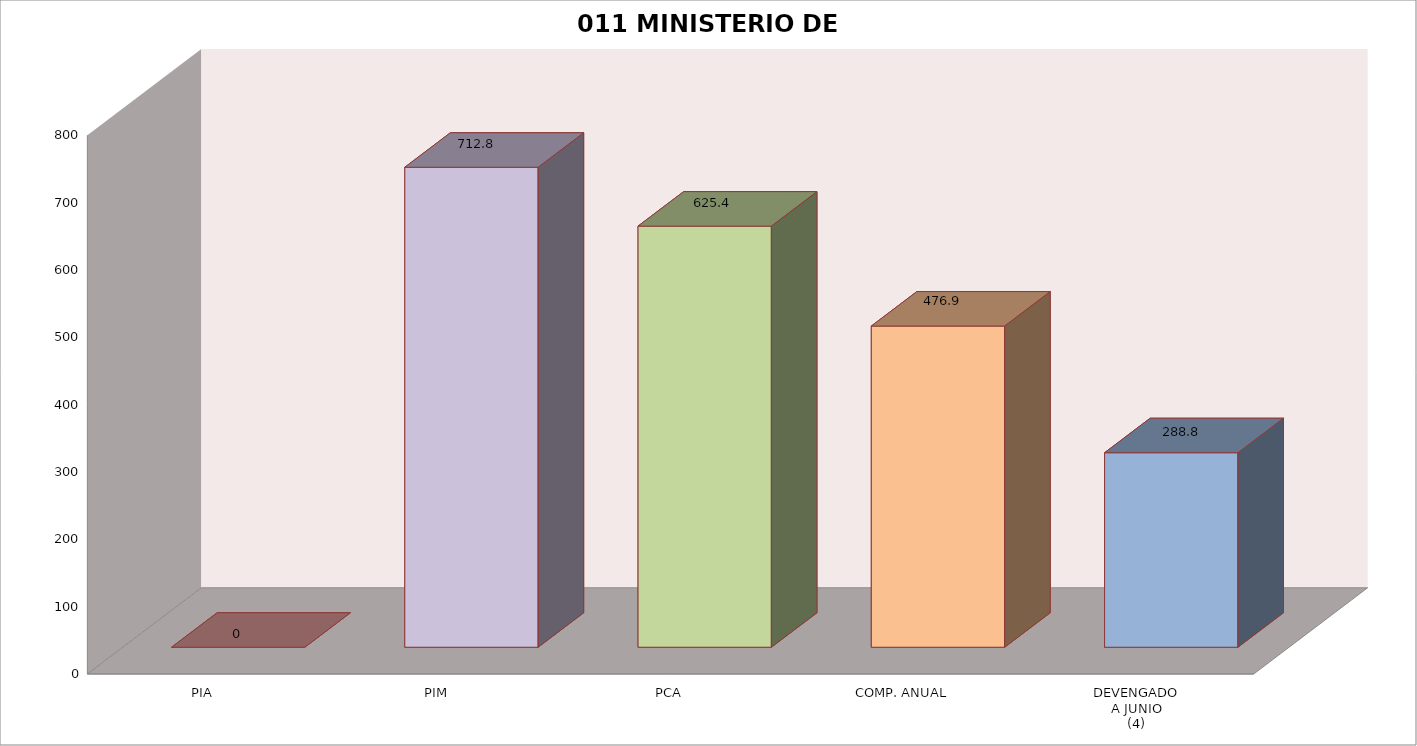
| Category | 011 MINISTERIO DE SALUD |
|---|---|
| PIA | 0 |
| PIM | 712.753 |
| PCA | 625.351 |
| COMP. ANUAL | 476.945 |
| DEVENGADO
A JUNIO
(4) | 288.845 |